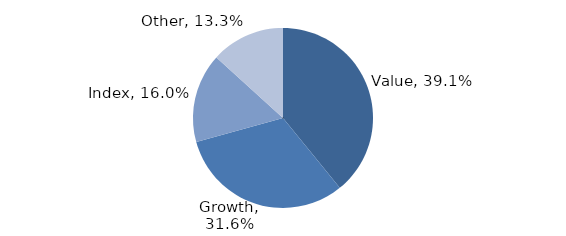
| Category | Investment Style |
|---|---|
| Value | 0.391 |
| Growth | 0.316 |
| Index | 0.16 |
| Other | 0.133 |